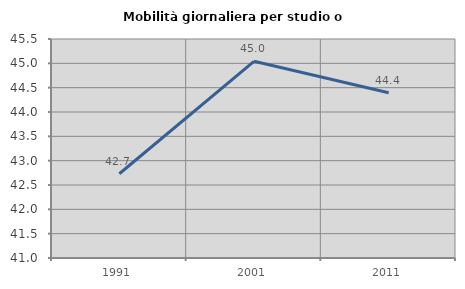
| Category | Mobilità giornaliera per studio o lavoro |
|---|---|
| 1991.0 | 42.731 |
| 2001.0 | 45.042 |
| 2011.0 | 44.395 |